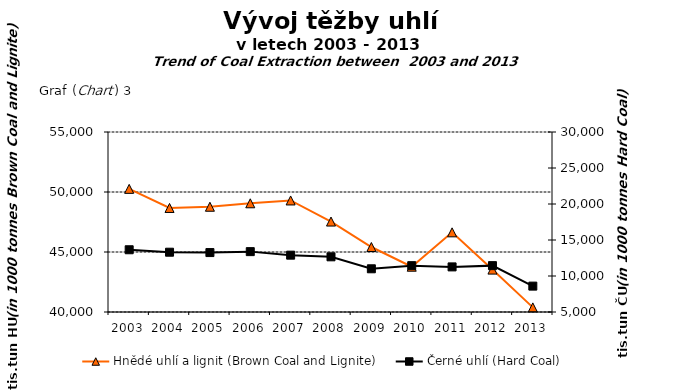
| Category | Hnědé uhlí a lignit (Brown Coal and Lignite) |
|---|---|
| 2003.0 | 50261 |
| 2004.0 | 48670 |
| 2005.0 | 48772 |
| 2006.0 | 49059 |
| 2007.0 | 49295 |
| 2008.0 | 47537 |
| 2009.0 | 45416 |
| 2010.0 | 43774 |
| 2011.0 | 46639 |
| 2012.0 | 43533 |
| 2013.0 | 40385 |